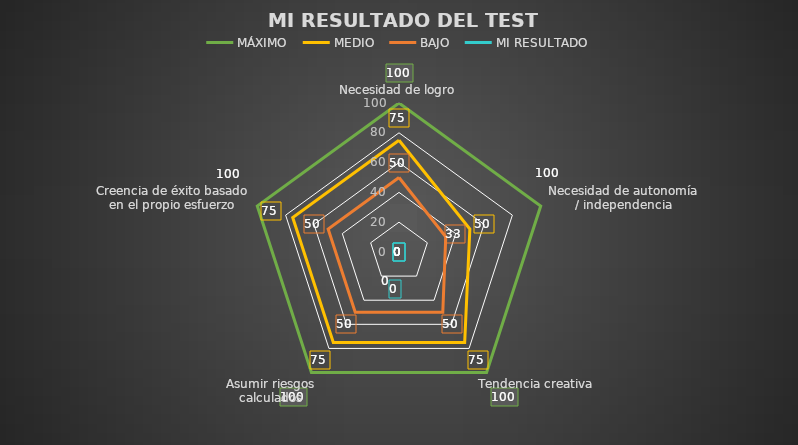
| Category | MÁXIMO | MEDIO | BAJO | MI RESULTADO |
|---|---|---|---|---|
| Necesidad de logro | 100 | 75 | 50 | 0 |
| Necesidad de autonomía / independencia | 100 | 50 | 33 | 0 |
| Tendencia creativa | 100 | 75 | 50 | 0 |
| Asumir riesgos calculados | 100 | 75 | 50 | 0 |
| Creencia de éxito basado en el propio esfuerzo | 100 | 75 | 50 | 0 |